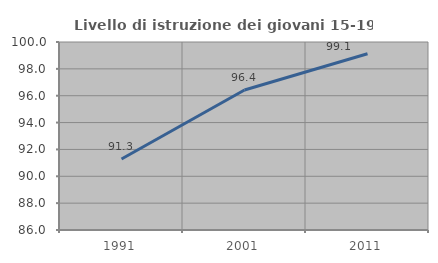
| Category | Livello di istruzione dei giovani 15-19 anni |
|---|---|
| 1991.0 | 91.288 |
| 2001.0 | 96.429 |
| 2011.0 | 99.127 |